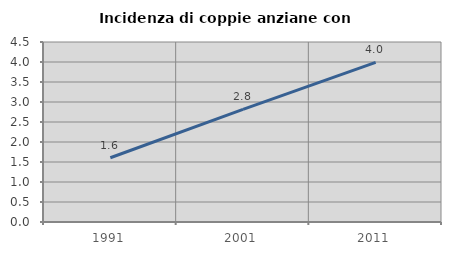
| Category | Incidenza di coppie anziane con figli |
|---|---|
| 1991.0 | 1.606 |
| 2001.0 | 2.814 |
| 2011.0 | 3.99 |